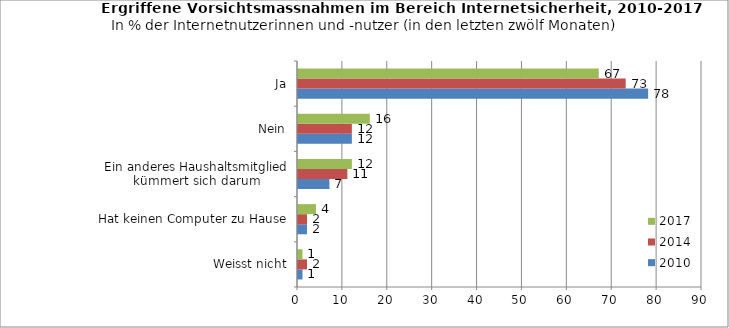
| Category | 2010 | 2014 | 2017 |
|---|---|---|---|
| Weisst nicht | 1 | 2 | 1 |
| Hat keinen Computer zu Hause | 2 | 2 | 4 |
| Ein anderes Haushaltsmitglied kümmert sich darum | 7 | 11 | 12 |
| Nein | 12 | 12 | 16 |
| Ja | 78 | 73 | 67 |